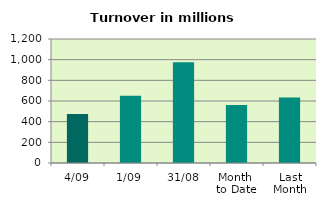
| Category | Series 0 |
|---|---|
| 4/09 | 474.626 |
| 1/09 | 649.962 |
| 31/08 | 975.097 |
| Month 
to Date | 562.294 |
| Last
Month | 632.895 |